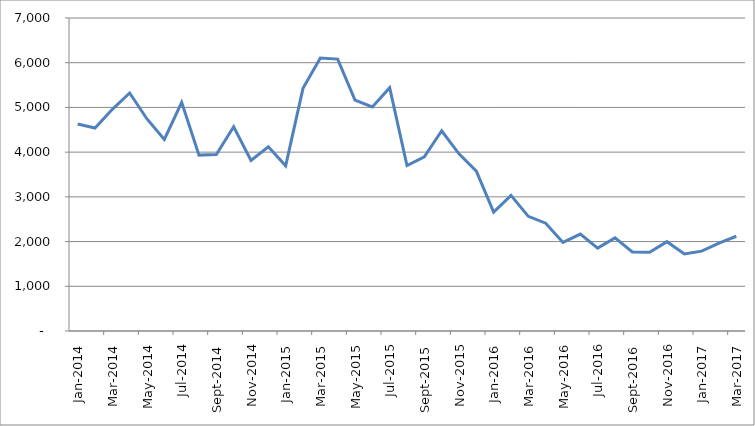
| Category | Series 0 |
|---|---|
| 2014-01-01 | 4629 |
| 2014-02-01 | 4540 |
| 2014-03-01 | 4957 |
| 2014-04-01 | 5324 |
| 2014-05-01 | 4742 |
| 2014-06-01 | 4285 |
| 2014-07-01 | 5113 |
| 2014-08-01 | 3934 |
| 2014-09-01 | 3945 |
| 2014-10-01 | 4567 |
| 2014-11-01 | 3814 |
| 2014-12-01 | 4120 |
| 2015-01-01 | 3694 |
| 2015-02-01 | 5426 |
| 2015-03-01 | 6104 |
| 2015-04-01 | 6081 |
| 2015-05-01 | 5164 |
| 2015-06-01 | 5011 |
| 2015-07-01 | 5442 |
| 2015-08-01 | 3698 |
| 2015-09-01 | 3897 |
| 2015-10-01 | 4479 |
| 2015-11-01 | 3963 |
| 2015-12-01 | 3576 |
| 2016-01-01 | 2659 |
| 2016-02-01 | 3034 |
| 2016-03-01 | 2564 |
| 2016-04-01 | 2412 |
| 2016-05-01 | 1981 |
| 2016-06-01 | 2167 |
| 2016-07-01 | 1854 |
| 2016-08-01 | 2082 |
| 2016-09-01 | 1769 |
| 2016-10-01 | 1762 |
| 2016-11-01 | 1998 |
| 2016-12-01 | 1723 |
| 2017-01-01 | 1786 |
| 2017-02-01 | 1964 |
| 2017-03-01 | 2119 |